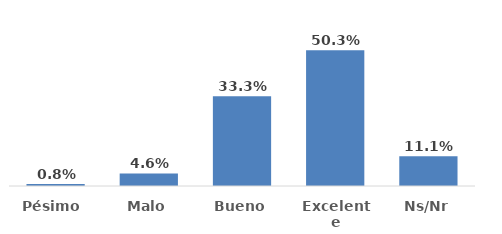
| Category | Series 0 |
|---|---|
| Pésimo  | 0.008 |
| Malo | 0.046 |
| Bueno | 0.333 |
| Excelente | 0.503 |
| Ns/Nr | 0.111 |